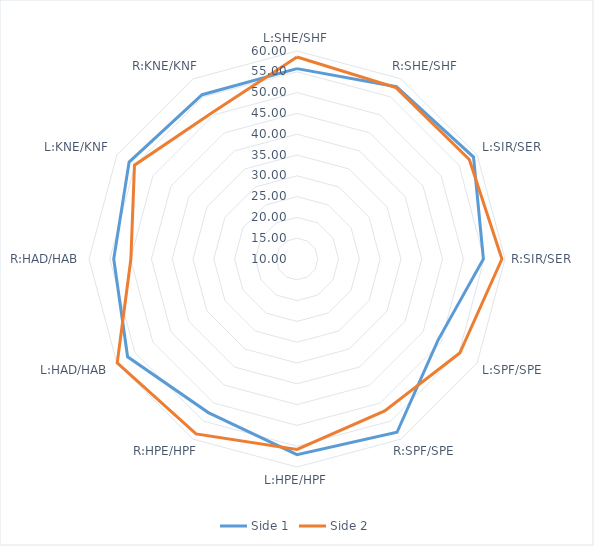
| Category | Side 1 | Side 2 |
|---|---|---|
| L:SHE/SHF | 55.76 | 58.57 |
| R:SHE/SHF | 57.81 | 57.57 |
| L:SIR/SER | 59 | 57.83 |
| R:SIR/SER | 54.81 | 59.26 |
| L:SPF/SPE | 49.12 | 55.19 |
| R:SPF/SPE | 58.09 | 52.17 |
| L:HPE/HPF | 57.04 | 55.78 |
| R:HPE/HPF | 52.63 | 58.54 |
| L:HAD/HAB | 57.02 | 59.9 |
| R:HAD/HAB | 54.05 | 49.93 |
| L:KNE/KNF | 56.6 | 55.11 |
| R:KNE/KNF | 55.61 | 50.69 |